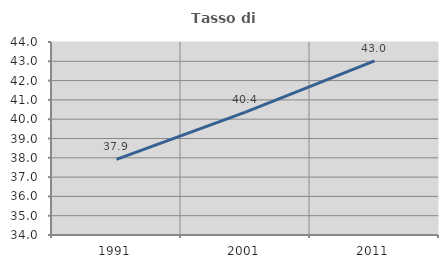
| Category | Tasso di occupazione   |
|---|---|
| 1991.0 | 37.921 |
| 2001.0 | 40.368 |
| 2011.0 | 43.017 |